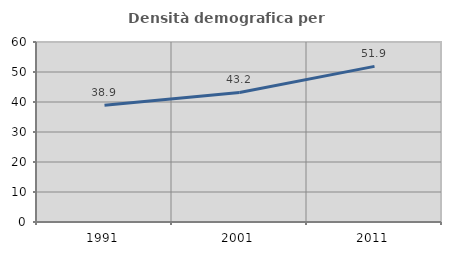
| Category | Densità demografica |
|---|---|
| 1991.0 | 38.949 |
| 2001.0 | 43.185 |
| 2011.0 | 51.882 |